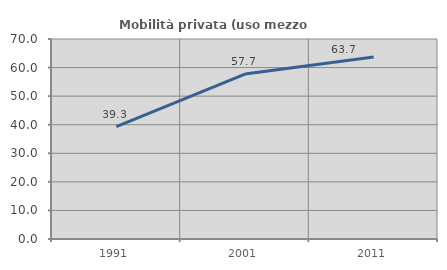
| Category | Mobilità privata (uso mezzo privato) |
|---|---|
| 1991.0 | 39.303 |
| 2001.0 | 57.744 |
| 2011.0 | 63.728 |